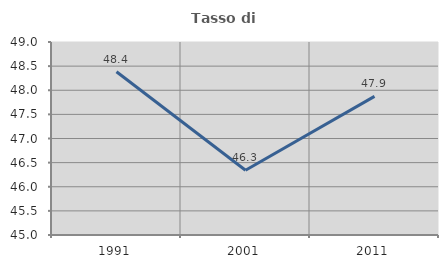
| Category | Tasso di occupazione   |
|---|---|
| 1991.0 | 48.382 |
| 2001.0 | 46.343 |
| 2011.0 | 47.874 |